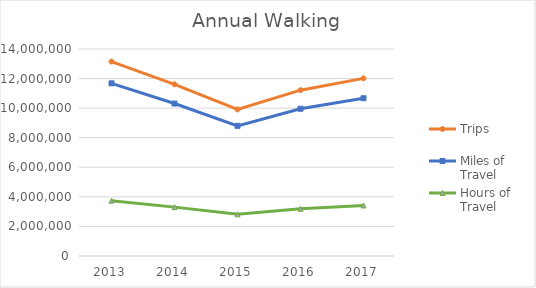
| Category | Trips | Miles of Travel | Hours of Travel |
|---|---|---|---|
| 2013 | 13151246.87 | 11677518.146 | 3744015.32 |
| 2014 | 11612894.91 | 10311553.907 | 3306063.439 |
| 2015 | 9914475.703 | 8803459.555 | 2822542.173 |
| 2016 | 11214861.294 | 9958123.937 | 3192747.647 |
| 2017 | 12014359.575 | 10668030.441 | 3420356.013 |